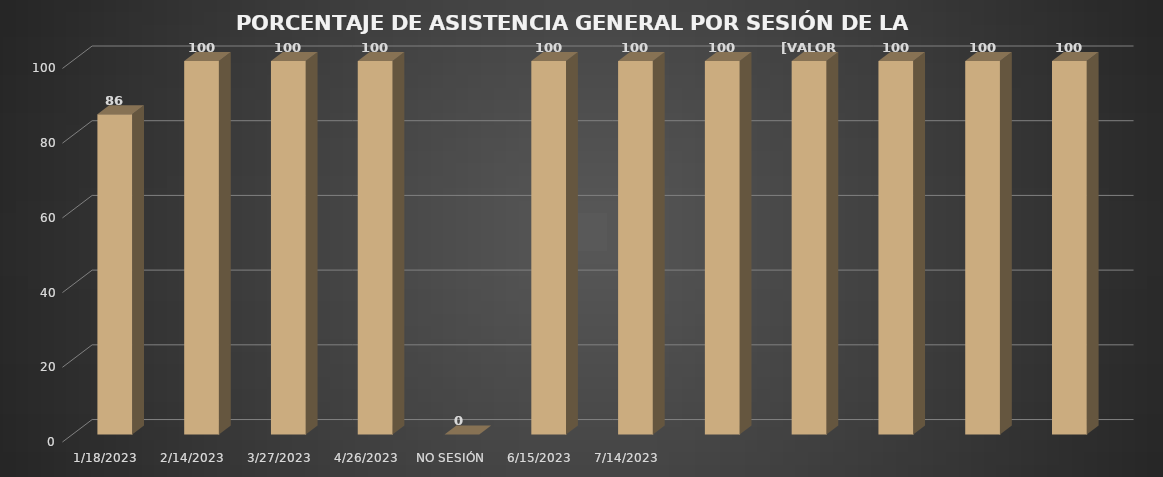
| Category | Series 0 |
|---|---|
| 18/01/2023 | 85.714 |
| 14/02/2023 | 100 |
| 27/03/2023 | 100 |
| 26/04/2023 | 100 |
| NO SESIÓN  | 0 |
| 15/06/2023 | 100 |
| 14/07/2023 | 100 |